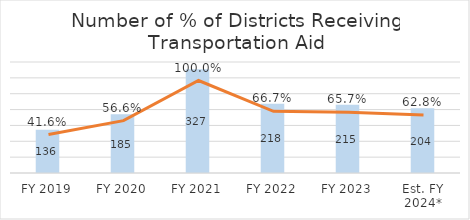
| Category | Number of Districts Receiving Aid |
|---|---|
| FY 2019 | 136 |
| FY 2020 | 185 |
| FY 2021 | 327 |
| FY 2022 | 218 |
| FY 2023 | 215 |
| Est. FY 2024* | 204 |